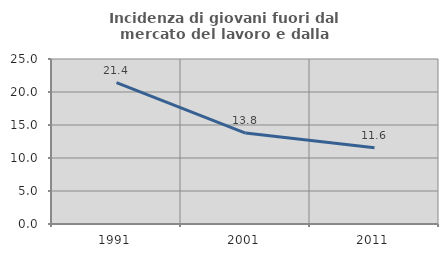
| Category | Incidenza di giovani fuori dal mercato del lavoro e dalla formazione  |
|---|---|
| 1991.0 | 21.418 |
| 2001.0 | 13.784 |
| 2011.0 | 11.55 |